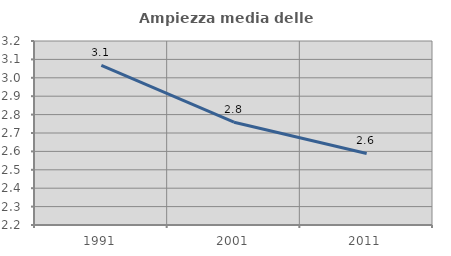
| Category | Ampiezza media delle famiglie |
|---|---|
| 1991.0 | 3.067 |
| 2001.0 | 2.759 |
| 2011.0 | 2.589 |